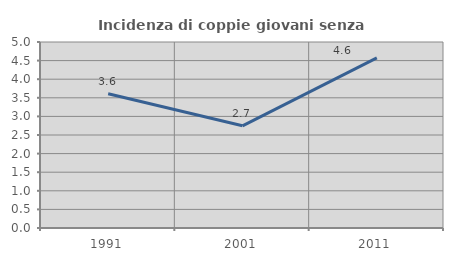
| Category | Incidenza di coppie giovani senza figli |
|---|---|
| 1991.0 | 3.608 |
| 2001.0 | 2.747 |
| 2011.0 | 4.571 |